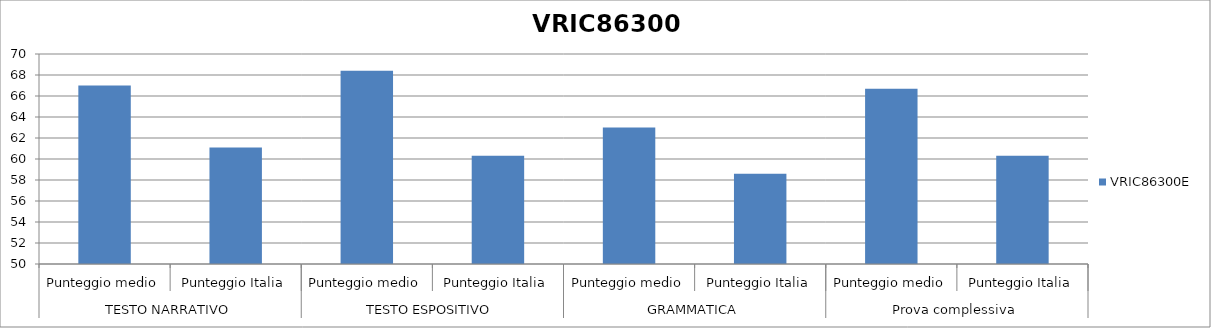
| Category | VRIC86300E |
|---|---|
| 0 | 67 |
| 1 | 61.1 |
| 2 | 68.4 |
| 3 | 60.3 |
| 4 | 63 |
| 5 | 58.6 |
| 6 | 66.7 |
| 7 | 60.3 |